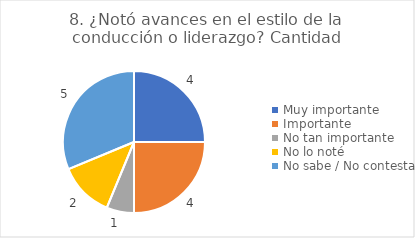
| Category | 8. ¿Notó avances en el estilo de la conducción o liderazgo? |
|---|---|
| Muy importante  | 0.25 |
| Importante  | 0.25 |
| No tan importante  | 0.062 |
| No lo noté  | 0.125 |
| No sabe / No contesta | 0.312 |